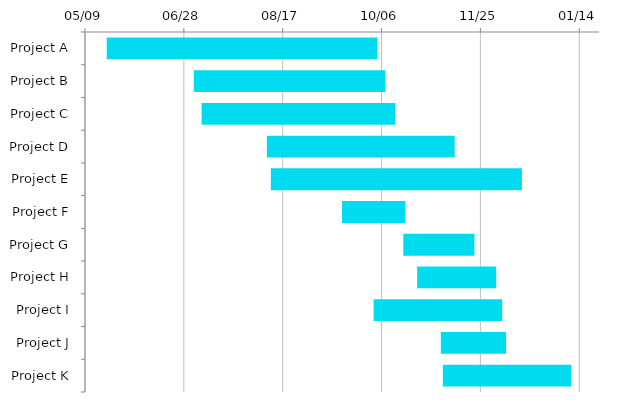
| Category | Start | Days |
|---|---|---|
| Project A | 2022-05-20 | 137 |
| Project B | 2022-07-03 | 97 |
| Project C | 2022-07-07 | 98 |
| Project D | 2022-08-09 | 95 |
| Project E | 2022-08-11 | 127 |
| Project F | 2022-09-16 | 32 |
| Project G | 2022-10-17 | 36 |
| Project H | 2022-10-24 | 40 |
| Project I | 2022-10-02 | 65 |
| Project J | 2022-11-05 | 33 |
| Project K | 2022-11-06 | 65 |